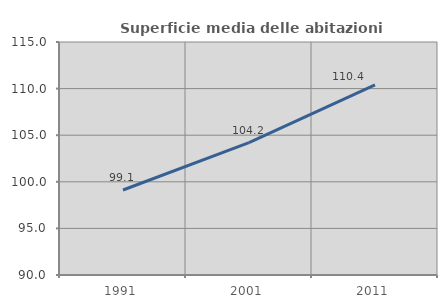
| Category | Superficie media delle abitazioni occupate |
|---|---|
| 1991.0 | 99.118 |
| 2001.0 | 104.212 |
| 2011.0 | 110.391 |